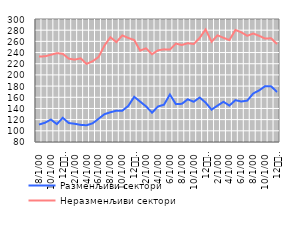
| Category | Разменљиви сектори | Неразменљиви сектори |
|---|---|---|
| 8 | 111.179 | 232.851 |
| 9 | 114.412 | 233.285 |
| 10 | 120.181 | 236.065 |
| 11 | 112.053 | 238.894 |
| 12
2010. | 123.205 | 237.81 |
| 1 | 113.969 | 229.146 |
| 2 | 112.583 | 227.313 |
| 3 | 110.626 | 229.675 |
| 4 | 109.967 | 219.656 |
| 5 | 113.351 | 224.363 |
| 6 | 121.419 | 231.8 |
| 7 | 129.705 | 252.437 |
| 8 | 133.191 | 267.413 |
| 9 | 135.96 | 258.668 |
| 10 | 135.989 | 270.642 |
| 11 | 144.436 | 266.09 |
| 12
2011. | 160.834 | 262.433 |
| 1 | 152.235 | 243.43 |
| 2 | 143.655 | 247.629 |
| 3 | 132.495 | 237.02 |
| 4 | 143.535 | 243.945 |
| 5 | 146.648 | 245.71 |
| 6 | 164.871 | 245.341 |
| 7 | 147.733 | 256.014 |
| 8 | 148.282 | 253.531 |
| 9 | 156.319 | 256.653 |
| 10 | 152.005 | 255.294 |
| 11 | 159.582 | 266.081 |
| 12
2012. | 150.504 | 281.37 |
| 1 | 137.828 | 259.263 |
| 2 | 145.113 | 270.822 |
| 3 | 151.866 | 266.373 |
| 4 | 145.153 | 262.261 |
| 5 | 154.832 | 280.425 |
| 6 | 152.427 | 276.172 |
| 7 | 154.041 | 269.983 |
| 8 | 166.782 | 274.064 |
| 9 | 172.314 | 269.93 |
| 10 | 179.944 | 264.957 |
| 11 | 179.679 | 265.565 |
| 12
2013. | 169.461 | 255.174 |